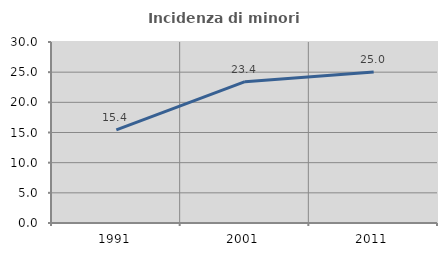
| Category | Incidenza di minori stranieri |
|---|---|
| 1991.0 | 15.441 |
| 2001.0 | 23.42 |
| 2011.0 | 25.008 |